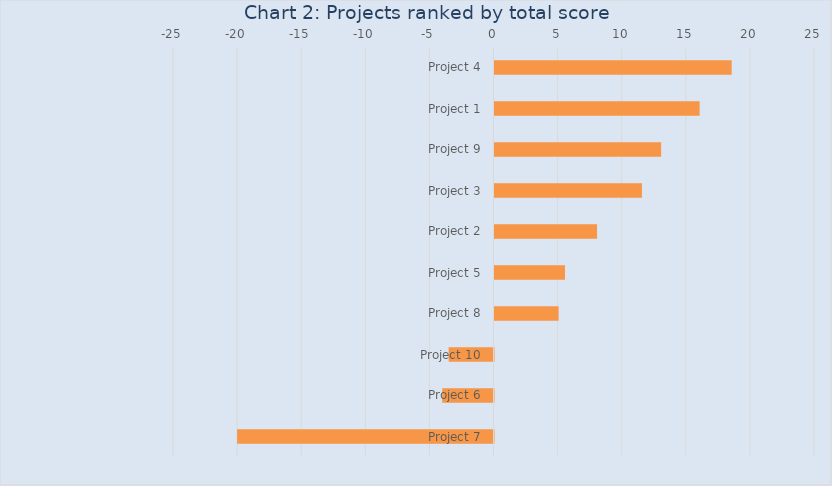
| Category | Series 0 |
|---|---|
| Project 4 | 18.5 |
| Project 1 | 16 |
| Project 9 | 13 |
| Project 3 | 11.5 |
| Project 2 | 8 |
| Project 5 | 5.5 |
| Project 8 | 5 |
| Project 10 | -3.5 |
| Project 6 | -4 |
| Project 7 | -20 |